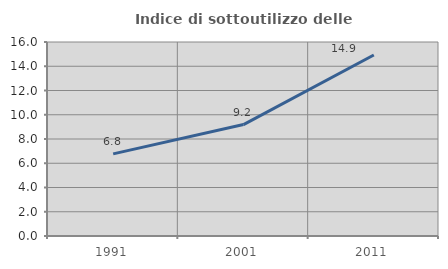
| Category | Indice di sottoutilizzo delle abitazioni  |
|---|---|
| 1991.0 | 6.771 |
| 2001.0 | 9.189 |
| 2011.0 | 14.927 |